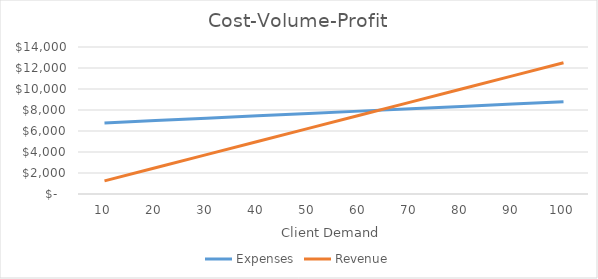
| Category | Expenses | Revenue |
|---|---|---|
| 10.0 | 6770.5 | 1250 |
| 20.0 | 6995 | 2500 |
| 30.0 | 7219.5 | 3750 |
| 40.0 | 7444 | 5000 |
| 50.0 | 7668.5 | 6250 |
| 60.0 | 7893 | 7500 |
| 70.0 | 8117.5 | 8750 |
| 80.0 | 8342 | 10000 |
| 90.0 | 8566.5 | 11250 |
| 100.0 | 8791 | 12500 |